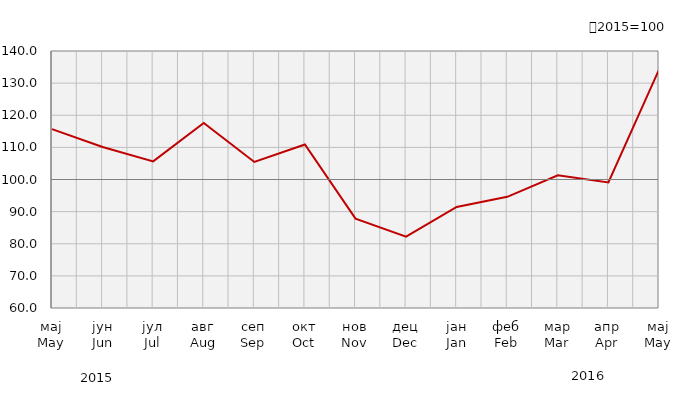
| Category | Индекси ноћења туриста
Tourist night indices |
|---|---|
| мај
May | 115.675 |
| јун
Jun | 110.099 |
| јул
Jul | 105.635 |
| авг
Aug | 117.617 |
| сеп
Sep | 105.466 |
| окт
Oct | 110.883 |
| нов
Nov | 87.836 |
| дец
Dec | 82.203 |
| јан
Jan | 91.47 |
| феб
Feb | 94.599 |
| мар
Mar | 101.315 |
| апр
Apr | 99.062 |
| мај
May | 134.186 |